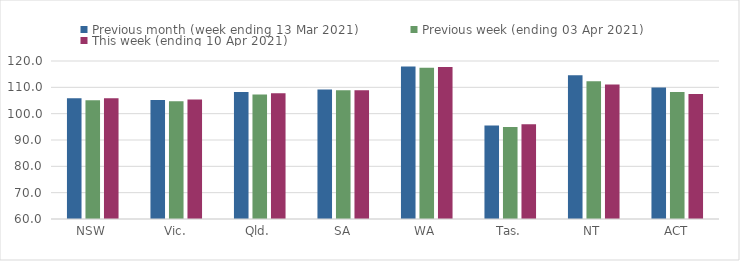
| Category | Previous month (week ending 13 Mar 2021) | Previous week (ending 03 Apr 2021) | This week (ending 10 Apr 2021) |
|---|---|---|---|
| NSW | 105.86 | 105.06 | 105.85 |
| Vic. | 105.23 | 104.7 | 105.42 |
| Qld. | 108.22 | 107.24 | 107.74 |
| SA | 109.13 | 108.85 | 108.93 |
| WA | 117.88 | 117.4 | 117.71 |
| Tas. | 95.53 | 94.98 | 95.95 |
| NT | 114.55 | 112.32 | 111.07 |
| ACT | 109.95 | 108.19 | 107.51 |